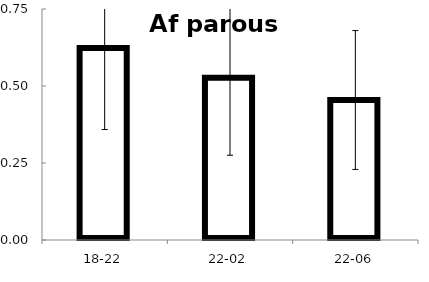
| Category | Series 0 |
|---|---|
| 18-22 | 0.623 |
| 22-02 | 0.527 |
| 22-06 | 0.455 |